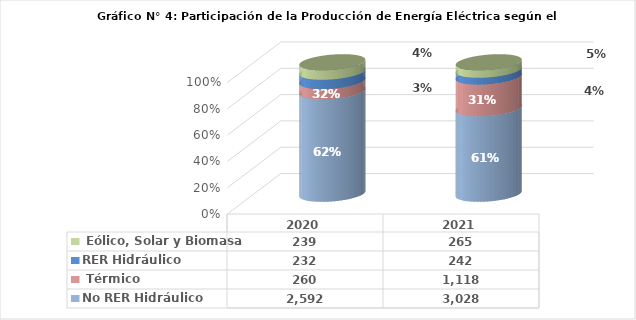
| Category | No RER | RER |
|---|---|---|
| 2020.0 | 259.627 | 238.62 |
| 2021.0 | 1117.755 | 264.579 |